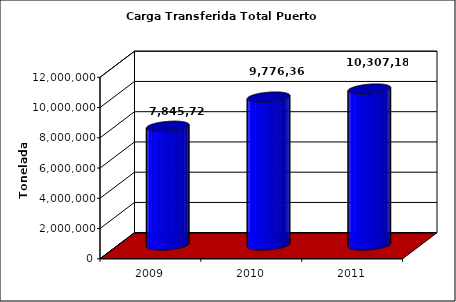
| Category | Series 0 |
|---|---|
| 2009.0 | 7845720.374 |
| 2010.0 | 9776361 |
| 2011.0 | 10307182 |